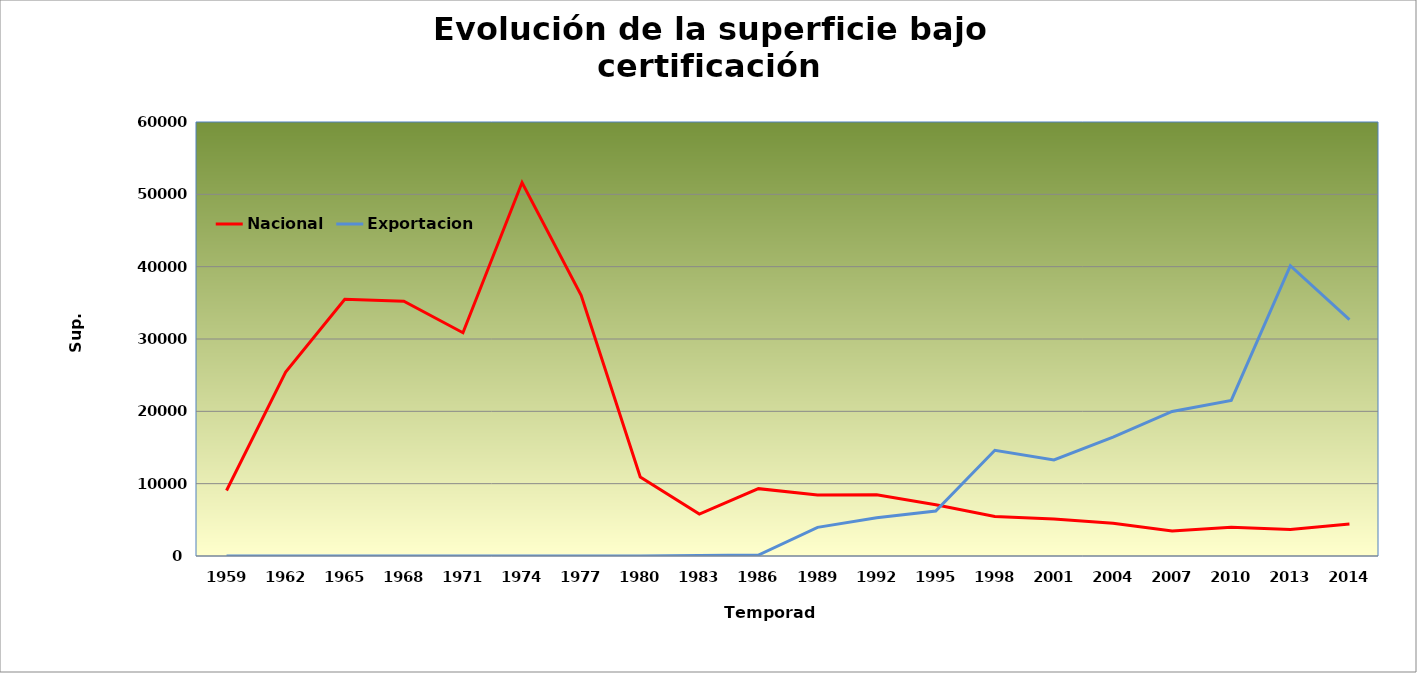
| Category | Nacional | Exportacion |
|---|---|---|
| 1959.0 | 9053 | 0 |
| 1962.0 | 25417 | 0 |
| 1965.0 | 35485 | 0 |
| 1968.0 | 35216 | 0 |
| 1971.0 | 30869 | 0 |
| 1974.0 | 51638 | 0 |
| 1977.0 | 36049 | 0 |
| 1980.0 | 10916 | 0 |
| 1983.0 | 5799 | 67 |
| 1986.0 | 9313 | 134 |
| 1989.0 | 8433 | 3957 |
| 1992.0 | 8479 | 5276 |
| 1995.0 | 7087 | 6206 |
| 1998.0 | 5461 | 14621 |
| 2001.0 | 5121 | 13275 |
| 2004.0 | 4517 | 16439 |
| 2007.0 | 3448 | 19979 |
| 2010.0 | 3989 | 21512 |
| 2013.0 | 3662 | 40125 |
| 2014.0 | 4409 | 32693 |